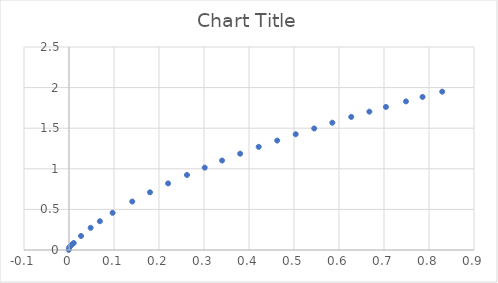
| Category | Series 0 |
|---|---|
| -0.000643086816720289 | 0.002 |
| 0.000203262607658044 | 0.028 |
| 0.00276728512610258 | 0.047 |
| 0.00618875673350746 | 0.066 |
| 0.0104676774298726 | 0.086 |
| 0.0267217487521549 | 0.173 |
| 0.0481149647759081 | 0.273 |
| 0.0686590564591375 | 0.354 |
| 0.0969104777365008 | 0.458 |
| 0.14058072057635 | 0.597 |
| 0.179974817635979 | 0.71 |
| 0.220227751242642 | 0.82 |
| 0.26219835794337 | 0.924 |
| 0.301602167209509 | 1.015 |
| 0.34014991484476 | 1.102 |
| 0.380413948116005 | 1.186 |
| 0.42153543047621 | 1.27 |
| 0.46265968775256 | 1.348 |
| 0.503783945028911 | 1.426 |
| 0.544910977221407 | 1.497 |
| 0.585180560324942 | 1.568 |
| 0.627165041606398 | 1.639 |
| 0.66743739962608 | 1.704 |
| 0.704282736206065 | 1.762 |
| 0.748840952212475 | 1.83 |
| 0.785687676250533 | 1.885 |
| 0.829389830626055 | 1.95 |